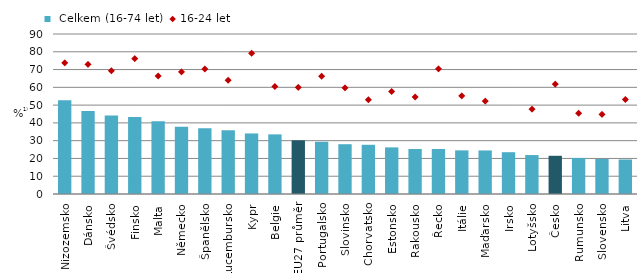
| Category |  Celkem (16-74 let) |
|---|---|
| Nizozemsko | 52.753 |
| Dánsko | 46.697 |
| Švédsko | 44.209 |
| Finsko | 43.352 |
| Malta | 40.909 |
| Německo | 37.764 |
| Španělsko | 36.982 |
| Lucembursko | 35.86 |
| Kypr | 34.057 |
| Belgie | 33.538 |
| EU27 průměr | 30.185 |
| Portugalsko | 29.388 |
| Slovinsko | 28.006 |
| Chorvatsko | 27.684 |
| Estonsko | 26.221 |
| Rakousko | 25.325 |
| Řecko | 25.298 |
| Itálie | 24.542 |
| Maďarsko | 24.495 |
| Irsko | 23.506 |
| Lotyšsko | 21.902 |
| Česko | 21.491 |
| Rumunsko | 20.284 |
| Slovensko | 19.724 |
| Litva | 19.42 |